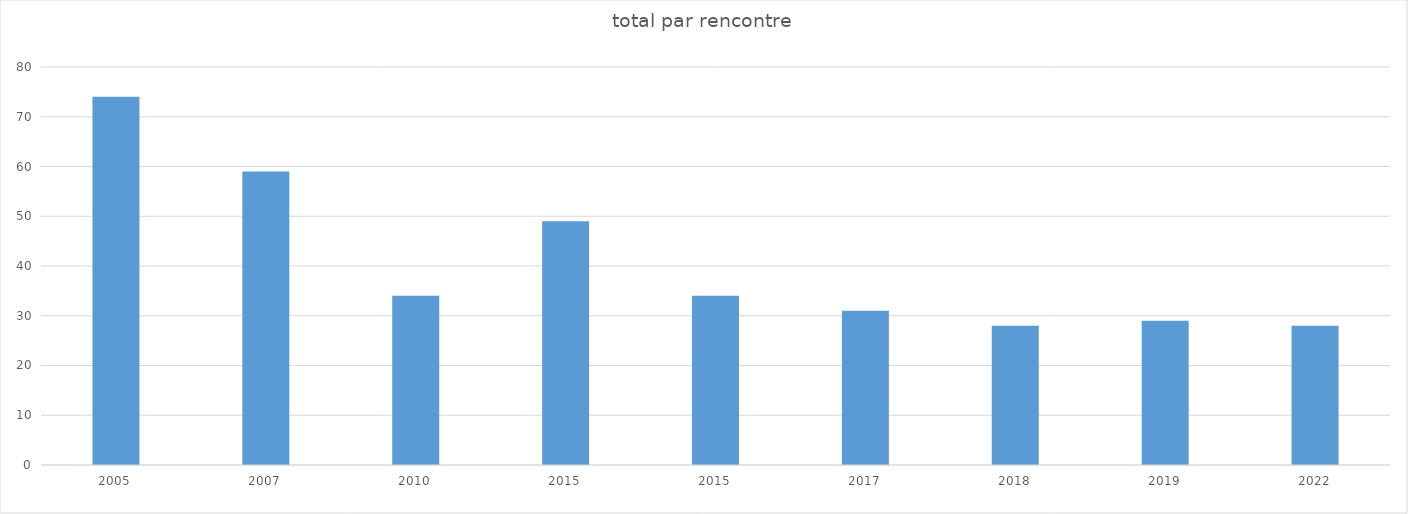
| Category | Series 0 |
|---|---|
| 2005.0 | 74 |
| 2007.0 | 59 |
| 2010.0 | 34 |
| 2015.0 | 49 |
| 2015.0 | 34 |
| 2017.0 | 31 |
| 2018.0 | 28 |
| 2019.0 | 29 |
| 2022.0 | 28 |